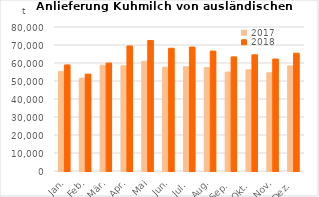
| Category | 2017 | 2018 |
|---|---|---|
| Jan. | 55225.614 | 58931.573 |
| Feb. | 51583.665 | 53830.549 |
| Mär. | 58734.297 | 59973.336 |
| Apr. | 58386.965 | 69468.248 |
| Mai | 60883.604 | 72509.213 |
| Jun. | 57592.644 | 68184.846 |
| Jul. | 57907.417 | 68863.053 |
| Aug. | 57443.481 | 66631.182 |
| Sep. | 54976.951 | 63390.54 |
| Okt. | 56223.032 | 64547.039 |
| Nov. | 54566.886 | 62230.689 |
| Dez. | 58370.223 | 65431.147 |